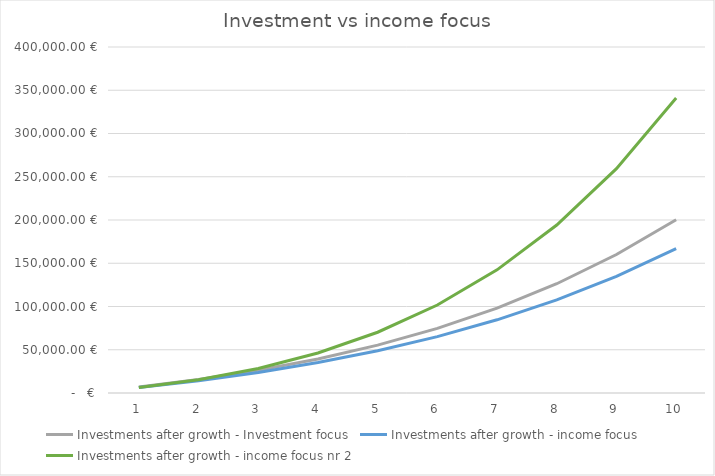
| Category | Investments after growth - Investment focus | Investments after growth - income focus | Investments after growth - income focus nr 2 |
|---|---|---|---|
| 1.0 | 6900 | 6420 | 6420 |
| 2.0 | 15525 | 14252.4 | 15429.4 |
| 3.0 | 26202.75 | 23740.518 | 28386.458 |
| 4.0 | 39317.062 | 35166.372 | 46268.36 |
| 5.0 | 55316.912 | 48856.638 | 70246.153 |
| 6.0 | 74726.968 | 65189.516 | 101719.165 |
| 7.0 | 98159.784 | 84602.632 | 142355.171 |
| 8.0 | 126329.899 | 107602.144 | 194137.213 |
| 9.0 | 160070.147 | 134773.221 | 259418.16 |
| 10.0 | 200350.508 | 166792.112 | 340984.215 |